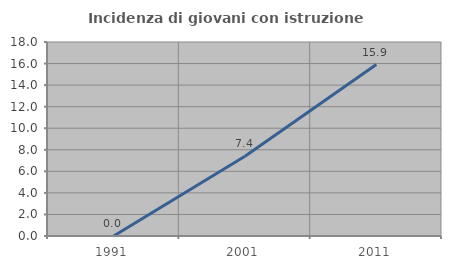
| Category | Incidenza di giovani con istruzione universitaria |
|---|---|
| 1991.0 | 0 |
| 2001.0 | 7.407 |
| 2011.0 | 15.909 |